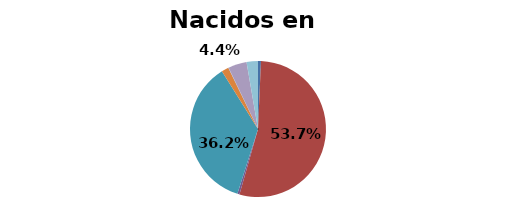
| Category | Nacidos en Bolivia |
|---|---|
| Mapuche | 0.007 |
| Aymara | 0.537 |
| Rapa Nui | 0 |
| Lican Antai | 0.005 |
| Quechua | 0.362 |
| Colla | 0.017 |
| Diaguita | 0.001 |
| Kawésqar | 0 |
| Yagán o Yámana | 0 |
| Otro | 0.044 |
| Pueblo ignorado | 0.027 |